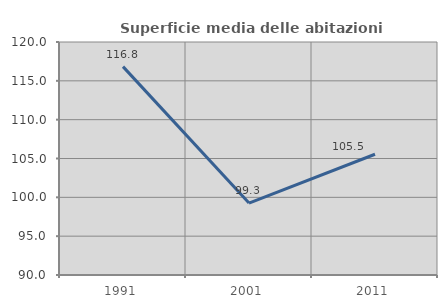
| Category | Superficie media delle abitazioni occupate |
|---|---|
| 1991.0 | 116.828 |
| 2001.0 | 99.259 |
| 2011.0 | 105.548 |